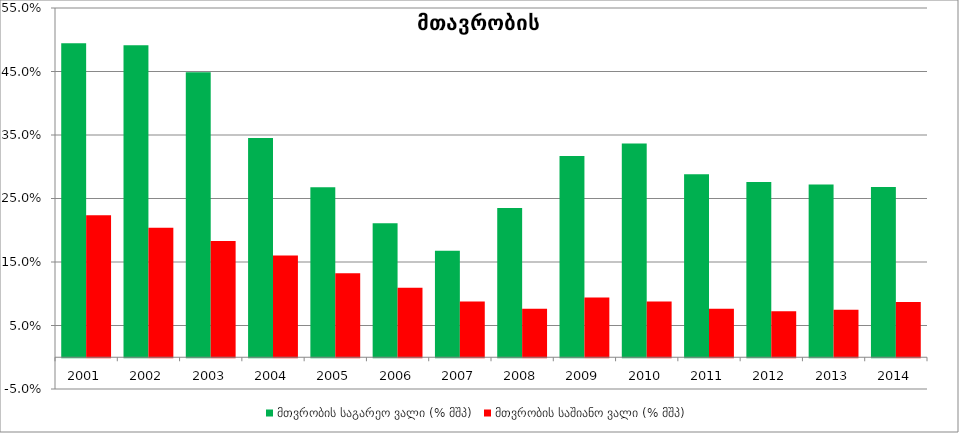
| Category | მთვრობის საგარეო ვალი (% მშპ) | მთვრობის საშიანო ვალი (% მშპ) |
|---|---|---|
| 2001.0 | 0.494 | 0.224 |
| 2002.0 | 0.491 | 0.204 |
| 2003.0 | 0.449 | 0.183 |
| 2004.0 | 0.345 | 0.16 |
| 2005.0 | 0.268 | 0.132 |
| 2006.0 | 0.211 | 0.11 |
| 2007.0 | 0.168 | 0.088 |
| 2008.0 | 0.235 | 0.076 |
| 2009.0 | 0.317 | 0.094 |
| 2010.0 | 0.336 | 0.088 |
| 2011.0 | 0.288 | 0.077 |
| 2012.0 | 0.276 | 0.072 |
| 2013.0 | 0.272 | 0.075 |
| 2014.0 | 0.268 | 0.087 |